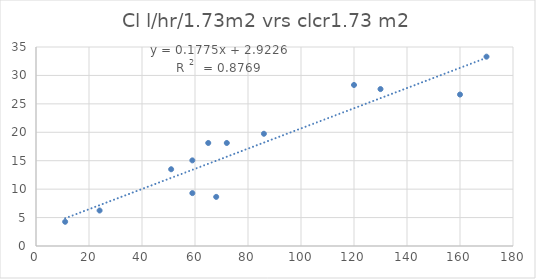
| Category | Series 0 |
|---|---|
| 72.0 | 18.12 |
| 11.0 | 4.26 |
| 68.0 | 8.64 |
| 24.0 | 6.24 |
| 51.0 | 13.5 |
| 59.0 | 9.3 |
| 120.0 | 28.32 |
| 65.0 | 18.12 |
| 130.0 | 27.6 |
| 170.0 | 33.3 |
| 160.0 | 26.64 |
| 59.0 | 15.06 |
| 86.0 | 19.74 |